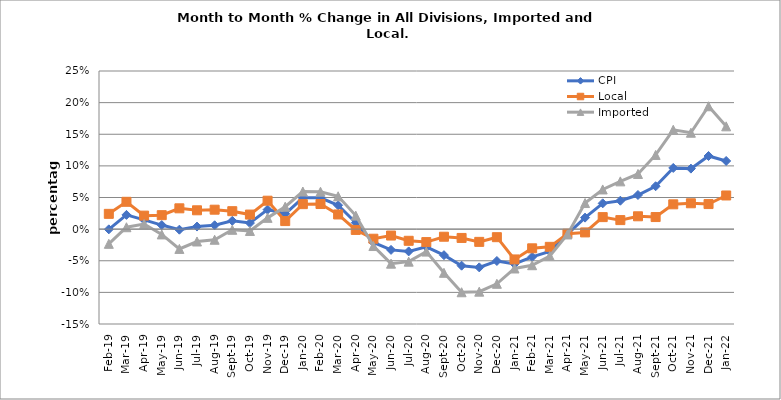
| Category | CPI | Local | Imported |
|---|---|---|---|
| 2019-02-01 | 0 | 0.024 | -0.023 |
| 2019-03-01 | 0.023 | 0.043 | 0.003 |
| 2019-04-01 | 0.015 | 0.021 | 0.008 |
| 2019-05-01 | 0.006 | 0.022 | -0.008 |
| 2019-06-01 | -0.001 | 0.033 | -0.031 |
| 2019-07-01 | 0.004 | 0.03 | -0.02 |
| 2019-08-01 | 0.006 | 0.031 | -0.017 |
| 2019-09-01 | 0.013 | 0.028 | -0.001 |
| 2019-10-01 | 0.01 | 0.023 | -0.003 |
| 2019-11-01 | 0.031 | 0.045 | 0.018 |
| 2019-12-01 | 0.024 | 0.013 | 0.035 |
| 2020-01-01 | 0.049 | 0.039 | 0.059 |
| 2020-02-01 | 0.05 | 0.04 | 0.059 |
| 2020-03-01 | 0.038 | 0.023 | 0.052 |
| 2020-04-01 | 0.01 | -0.001 | 0.021 |
| 2020-05-01 | -0.021 | -0.015 | -0.027 |
| 2020-06-01 | -0.033 | -0.01 | -0.055 |
| 2020-07-01 | -0.035 | -0.018 | -0.051 |
| 2020-08-01 | -0.028 | -0.02 | -0.036 |
| 2020-09-01 | -0.041 | -0.012 | -0.069 |
| 2020-10-01 | -0.058 | -0.014 | -0.1 |
| 2020-11-01 | -0.06 | -0.02 | -0.099 |
| 2020-12-01 | -0.05 | -0.013 | -0.086 |
| 2021-01-01 | -0.055 | -0.048 | -0.062 |
| 2021-02-01 | -0.044 | -0.03 | -0.057 |
| 2021-03-01 | -0.035 | -0.028 | -0.043 |
| 2021-04-01 | -0.008 | -0.007 | -0.008 |
| 2021-05-01 | 0.018 | -0.005 | 0.041 |
| 2021-06-01 | 0.041 | 0.019 | 0.063 |
| 2021-07-01 | 0.045 | 0.014 | 0.075 |
| 2021-08-01 | 0.054 | 0.02 | 0.087 |
| 2021-09-01 | 0.068 | 0.019 | 0.117 |
| 2021-10-01 | 0.097 | 0.039 | 0.157 |
| 2021-11-01 | 0.096 | 0.041 | 0.152 |
| 2021-12-01 | 0.116 | 0.04 | 0.194 |
| 2022-01-01 | 0.108 | 0.053 | 0.163 |